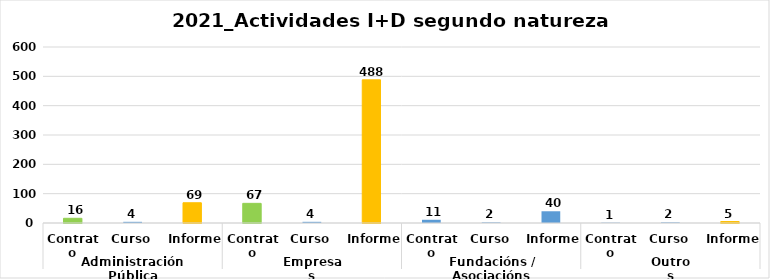
| Category | Series 0 |
|---|---|
| 0 | 16 |
| 1 | 4 |
| 2 | 69 |
| 3 | 67 |
| 4 | 4 |
| 5 | 488 |
| 6 | 11 |
| 7 | 2 |
| 8 | 40 |
| 9 | 1 |
| 10 | 2 |
| 11 | 5 |